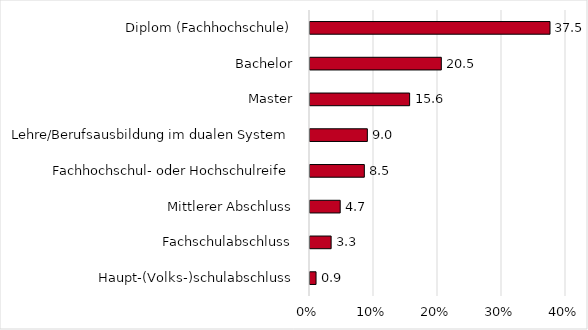
| Category | Series 0 |
|---|---|
| Haupt-(Volks-)schulabschluss | 0.943 |
| Fachschulabschluss | 3.302 |
| Mittlerer Abschluss | 4.717 |
| Fachhochschul- oder Hochschulreife | 8.491 |
| Lehre/Berufsausbildung im dualen System | 8.962 |
| Master | 15.566 |
| Bachelor | 20.519 |
| Diplom (Fachhochschule) | 37.5 |